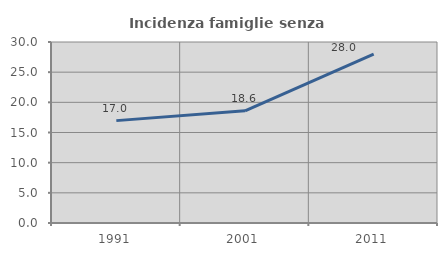
| Category | Incidenza famiglie senza nuclei |
|---|---|
| 1991.0 | 16.968 |
| 2001.0 | 18.588 |
| 2011.0 | 27.978 |